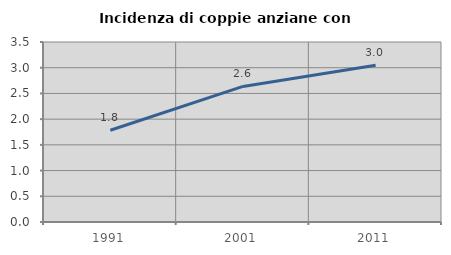
| Category | Incidenza di coppie anziane con figli |
|---|---|
| 1991.0 | 1.785 |
| 2001.0 | 2.636 |
| 2011.0 | 3.049 |